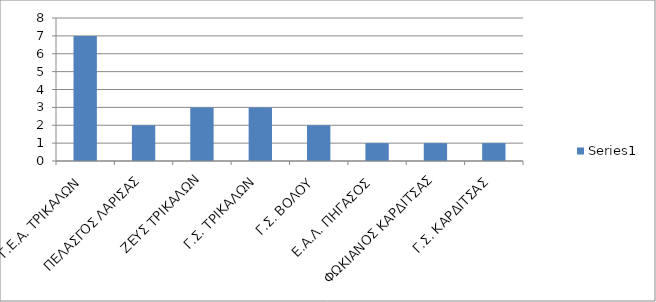
| Category | Series 0 |
|---|---|
| Γ.Ε.Α. ΤΡΙΚΑΛΩΝ | 7 |
| ΠΕΛΑΣΓΟΣ ΛΑΡΙΣΑΣ | 2 |
| ΖΕΥΣ ΤΡΙΚΑΛΩΝ | 3 |
| Γ.Σ. ΤΡΙΚΑΛΩΝ | 3 |
| Γ.Σ. ΒΟΛΟΥ | 2 |
| Ε.Α.Λ. ΠΗΓΑΣΟΣ | 1 |
| ΦΩΚΙΑΝΟΣ ΚΑΡΔΙΤΣΑΣ | 1 |
| Γ.Σ. ΚΑΡΔΙΤΣΑΣ | 1 |